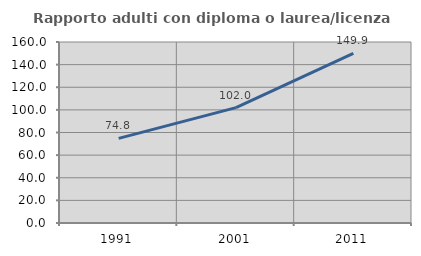
| Category | Rapporto adulti con diploma o laurea/licenza media  |
|---|---|
| 1991.0 | 74.772 |
| 2001.0 | 102.021 |
| 2011.0 | 149.918 |